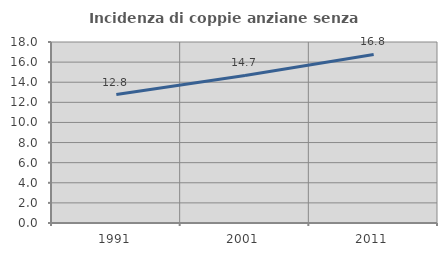
| Category | Incidenza di coppie anziane senza figli  |
|---|---|
| 1991.0 | 12.769 |
| 2001.0 | 14.671 |
| 2011.0 | 16.76 |